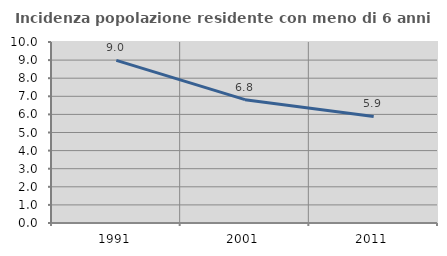
| Category | Incidenza popolazione residente con meno di 6 anni |
|---|---|
| 1991.0 | 8.982 |
| 2001.0 | 6.814 |
| 2011.0 | 5.886 |